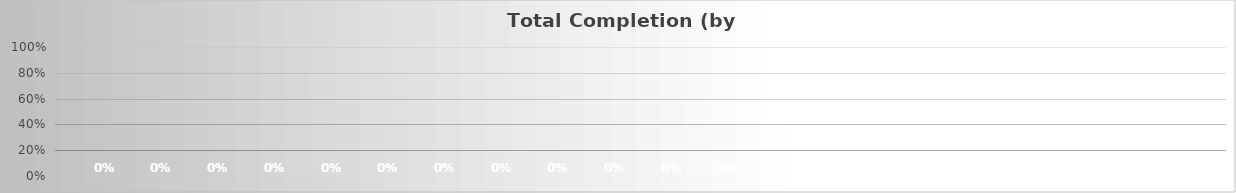
| Category | Series 1 | Series 2 | Series 3 | Series 4 | Series 5 | Series 6 | Series 7 | Series 8 | Series 9 | Series 10 | Series 11 | Series 12 | Series 13 | Series 14 | Series 15 | Series 16 | Series 17 | Total Percentage Complete: | Series 19 | Series 0 |
|---|---|---|---|---|---|---|---|---|---|---|---|---|---|---|---|---|---|---|---|---|
| Total Percentage Complete: | 0 | 0 | 0 | 0 | 0 | 0 | 0 | 0 | 0 | 0 | 0 | 0 | 0 | 0 | 0 | 0 | 0 | 0 | 0 | 0 |